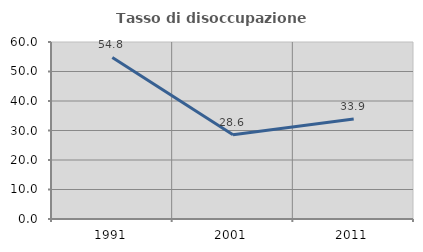
| Category | Tasso di disoccupazione giovanile  |
|---|---|
| 1991.0 | 54.762 |
| 2001.0 | 28.571 |
| 2011.0 | 33.871 |